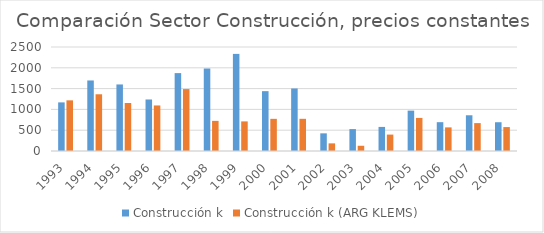
| Category | Construcción k | Construcción k (ARG KLEMS) |
|---|---|---|
| 1993.0 | 1168.701 | 1217.633 |
| 1994.0 | 1695.526 | 1363.516 |
| 1995.0 | 1599.722 | 1154.129 |
| 1996.0 | 1238.624 | 1094.724 |
| 1997.0 | 1872.379 | 1488.371 |
| 1998.0 | 1982.795 | 724.182 |
| 1999.0 | 2334.315 | 711.69 |
| 2000.0 | 1438.762 | 773.045 |
| 2001.0 | 1503.192 | 773.809 |
| 2002.0 | 424.46 | 183.551 |
| 2003.0 | 526.516 | 125.572 |
| 2004.0 | 578.811 | 394.42 |
| 2005.0 | 970.539 | 794.988 |
| 2006.0 | 693.137 | 567.6 |
| 2007.0 | 858.952 | 670.572 |
| 2008.0 | 691.734 | 575.205 |